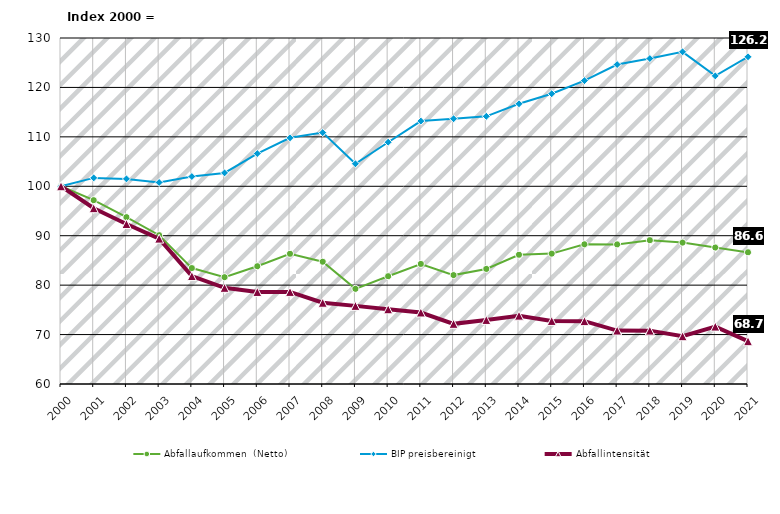
| Category | Abfallaufkommen  (Netto)  | BIP preisbereinigt | Abfallintensität |
|---|---|---|---|
| 2000.0 | 100 | 100 | 100 |
| 2001.0 | 97.187 | 101.698 | 95.564 |
| 2002.0 | 93.754 | 101.496 | 92.372 |
| 2003.0 | 90.102 | 100.772 | 89.412 |
| 2004.0 | 83.452 | 101.971 | 81.839 |
| 2005.0 | 81.61 | 102.707 | 79.459 |
| 2006.0 | 83.828 | 106.625 | 78.62 |
| 2007.0 | 86.34 | 109.806 | 78.629 |
| 2008.0 | 84.739 | 110.863 | 76.436 |
| 2009.0 | 79.253 | 104.547 | 75.806 |
| 2010.0 | 81.81 | 108.916 | 75.113 |
| 2011.0 | 84.289 | 113.19 | 74.467 |
| 2012.0 | 82.033 | 113.665 | 72.171 |
| 2013.0 | 83.282 | 114.152 | 72.957 |
| 2014.0 | 86.145 | 116.692 | 73.822 |
| 2015.0 | 86.378 | 118.723 | 72.756 |
| 2016.0 | 88.257 | 121.37 | 72.717 |
| 2017.0 | 88.245 | 124.623 | 70.809 |
| 2018.0 | 89.094 | 125.846 | 70.796 |
| 2019.0 | 88.609 | 127.199 | 69.661 |
| 2020.0 | 87.609 | 122.332 | 71.616 |
| 2021.0 | 86.648 | 126.202 | 68.658 |